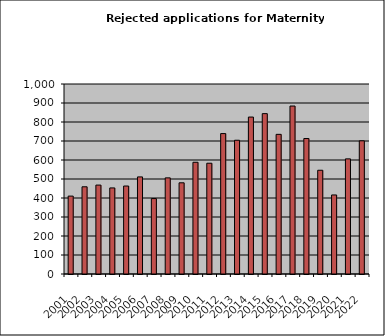
| Category | Series 0 |
|---|---|
| 2001.0 | 410 |
| 2002.0 | 459 |
| 2003.0 | 468 |
| 2004.0 | 453 |
| 2005.0 | 463 |
| 2006.0 | 511 |
| 2007.0 | 397 |
| 2008.0 | 506 |
| 2009.0 | 480 |
| 2010.0 | 588 |
| 2011.0 | 583 |
| 2012.0 | 739 |
| 2013.0 | 704 |
| 2014.0 | 826 |
| 2015.0 | 844 |
| 2016.0 | 735 |
| 2017.0 | 884 |
| 2018.0 | 713 |
| 2019.0 | 546 |
| 2020.0 | 416 |
| 2021.0 | 606 |
| 2022.0 | 701 |